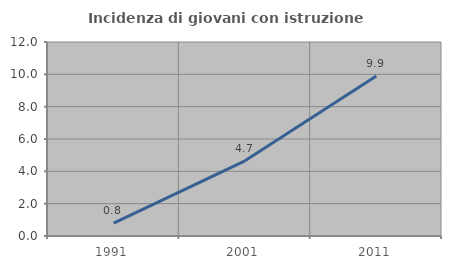
| Category | Incidenza di giovani con istruzione universitaria |
|---|---|
| 1991.0 | 0.794 |
| 2001.0 | 4.651 |
| 2011.0 | 9.896 |